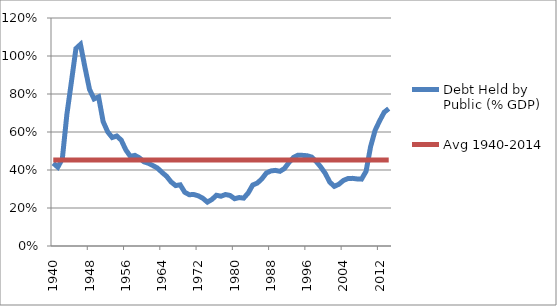
| Category | Debt Held by Public (% GDP) | Avg 1940-2014 |
|---|---|---|
| 1940-01-01 | 0.436 | 0.452 |
| 1941-01-01 | 0.415 | 0.452 |
| 1942-01-01 | 0.459 | 0.452 |
| 1943-01-01 | 0.692 | 0.452 |
| 1944-01-01 | 0.864 | 0.452 |
| 1945-01-01 | 1.039 | 0.452 |
| 1946-01-01 | 1.061 | 0.452 |
| 1947-01-01 | 0.939 | 0.452 |
| 1948-01-01 | 0.824 | 0.452 |
| 1949-01-01 | 0.774 | 0.452 |
| 1950-01-01 | 0.785 | 0.452 |
| 1951-01-01 | 0.655 | 0.452 |
| 1952-01-01 | 0.601 | 0.452 |
| 1953-01-01 | 0.571 | 0.452 |
| 1954-01-01 | 0.579 | 0.452 |
| 1955-01-01 | 0.557 | 0.452 |
| 1956-01-01 | 0.506 | 0.452 |
| 1957-01-01 | 0.472 | 0.452 |
| 1958-01-01 | 0.477 | 0.452 |
| 1959-01-01 | 0.464 | 0.452 |
| 1960-01-01 | 0.443 | 0.452 |
| 1961-01-01 | 0.435 | 0.452 |
| 1962-01-01 | 0.423 | 0.452 |
| 1963-01-01 | 0.41 | 0.452 |
| 1964-01-01 | 0.387 | 0.452 |
| 1965-01-01 | 0.367 | 0.452 |
| 1966-01-01 | 0.337 | 0.452 |
| 1967-01-01 | 0.318 | 0.452 |
| 1968-01-01 | 0.322 | 0.452 |
| 1969-01-01 | 0.283 | 0.452 |
| 1970-01-01 | 0.27 | 0.452 |
| 1971-01-01 | 0.271 | 0.452 |
| 1972-01-01 | 0.264 | 0.452 |
| 1973-01-01 | 0.251 | 0.452 |
| 1974-01-01 | 0.231 | 0.452 |
| 1975-01-01 | 0.245 | 0.452 |
| 1976-01-01 | 0.267 | 0.452 |
| 1977-01-01 | 0.262 | 0.452 |
| 1978-01-01 | 0.271 | 0.452 |
| 1979-01-01 | 0.266 | 0.452 |
| 1980-01-01 | 0.249 | 0.452 |
| 1981-01-01 | 0.255 | 0.452 |
| 1982-01-01 | 0.252 | 0.452 |
| 1983-01-01 | 0.279 | 0.452 |
| 1984-01-01 | 0.321 | 0.452 |
| 1985-01-01 | 0.331 | 0.452 |
| 1986-01-01 | 0.353 | 0.452 |
| 1987-01-01 | 0.384 | 0.452 |
| 1988-01-01 | 0.395 | 0.452 |
| 1989-01-01 | 0.398 | 0.452 |
| 1990-01-01 | 0.393 | 0.452 |
| 1991-01-01 | 0.408 | 0.452 |
| 1992-01-01 | 0.44 | 0.452 |
| 1993-01-01 | 0.466 | 0.452 |
| 1994-01-01 | 0.478 | 0.452 |
| 1995-01-01 | 0.477 | 0.452 |
| 1996-01-01 | 0.475 | 0.452 |
| 1997-01-01 | 0.468 | 0.452 |
| 1998-01-01 | 0.445 | 0.452 |
| 1999-01-01 | 0.416 | 0.452 |
| 2000-01-01 | 0.382 | 0.452 |
| 2001-01-01 | 0.336 | 0.452 |
| 2002-01-01 | 0.314 | 0.452 |
| 2003-01-01 | 0.325 | 0.452 |
| 2004-01-01 | 0.345 | 0.452 |
| 2005-01-01 | 0.355 | 0.452 |
| 2006-01-01 | 0.356 | 0.452 |
| 2007-01-01 | 0.353 | 0.452 |
| 2008-01-01 | 0.352 | 0.452 |
| 2009-01-01 | 0.393 | 0.452 |
| 2010-01-01 | 0.523 | 0.452 |
| 2011-01-01 | 0.609 | 0.452 |
| 2012-01-01 | 0.659 | 0.452 |
| 2013-01-01 | 0.704 | 0.452 |
| 2014-01-01 | 0.723 | 0.452 |